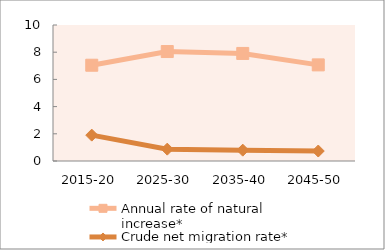
| Category | Annual rate of natural increase* | Crude net migration rate* |
|---|---|---|
| 2015-20 | 7.042 | 1.902 |
| 2025-30 | 8.049 | 0.871 |
| 2035-40 | 7.908 | 0.797 |
| 2045-50 | 7.068 | 0.733 |